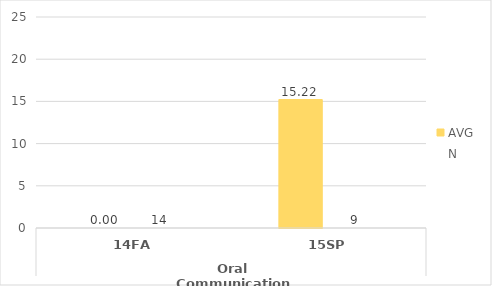
| Category | English - AVG | English - N |
|---|---|---|
| 0 | 0 | 14 |
| 1 | 15.222 | 9 |